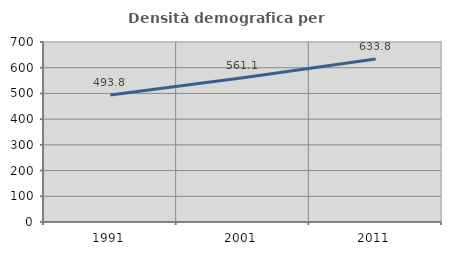
| Category | Densità demografica |
|---|---|
| 1991.0 | 493.768 |
| 2001.0 | 561.055 |
| 2011.0 | 633.808 |